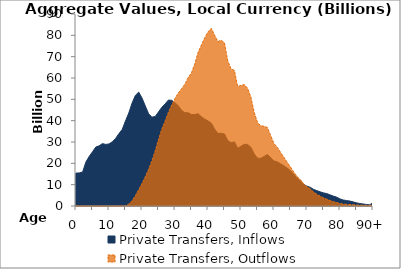
| Category | Private Transfers, Inflows | Private Transfers, Outflows |
|---|---|---|
| 0 | 15424.118 | 0 |
|  | 15508.026 | 0 |
| 2 | 15924.417 | 0 |
| 3 | 20610.805 | 0 |
| 4 | 23240.93 | 0 |
| 5 | 25407.215 | 0 |
| 6 | 27637.973 | 0 |
| 7 | 28204.765 | 0 |
| 8 | 29240.108 | 0 |
| 9 | 28872.986 | 0 |
| 10 | 29076.78 | 0 |
| 11 | 30104.654 | 0 |
| 12 | 31667.287 | 0 |
| 13 | 33916.751 | 0 |
| 14 | 35869.759 | 0 |
| 15 | 39900.61 | 0 |
| 16 | 43595.457 | 883.694 |
| 17 | 48253.527 | 2489.963 |
| 18 | 51865.69 | 4867.217 |
| 19 | 53394.996 | 7628.706 |
| 20 | 50611.978 | 10527.117 |
| 21 | 46886.996 | 13708.263 |
| 22 | 43244.668 | 17188.14 |
| 23 | 41641.143 | 21154.428 |
| 24 | 41950.415 | 25794.757 |
| 25 | 44085.263 | 31074.081 |
| 26 | 46262.269 | 36034.038 |
| 27 | 47843.747 | 39749.822 |
| 28 | 49655.21 | 43872.178 |
| 29 | 49543.745 | 47306.037 |
| 30 | 48342.223 | 50436.195 |
| 31 | 47005.04 | 52994.875 |
| 32 | 44838.663 | 54981.061 |
| 33 | 43709.393 | 57082.451 |
| 34 | 43710.909 | 60201.495 |
| 35 | 42891.553 | 62430.823 |
| 36 | 42863.05 | 66648.182 |
| 37 | 43243.87 | 72008.931 |
| 38 | 41875.267 | 75476.226 |
| 39 | 40717.283 | 78768.706 |
| 40 | 39873.162 | 81591.841 |
| 41 | 38861.077 | 83312.743 |
| 42 | 36048.793 | 80058.21 |
| 43 | 34018.095 | 77086.05 |
| 44 | 34104.392 | 77699.649 |
| 45 | 33731.683 | 76486.409 |
| 46 | 30620.82 | 67987.062 |
| 47 | 29674.507 | 64243.197 |
| 48 | 30062.989 | 63540.632 |
| 49 | 27072.434 | 55990.27 |
| 50 | 28013.59 | 56548.708 |
| 51 | 28912.844 | 56935.456 |
| 52 | 28844.154 | 55181.518 |
| 53 | 27512.142 | 51039.648 |
| 54 | 24408.23 | 43908.49 |
| 55 | 22435.713 | 39134.904 |
| 56 | 22360.447 | 37599.818 |
| 57 | 23233.719 | 37356.406 |
| 58 | 24123.864 | 36831.275 |
| 59 | 22655.52 | 32999.661 |
| 60 | 21086.427 | 29283.111 |
| 61 | 20699.006 | 27527.773 |
| 62 | 19777.314 | 25126.354 |
| 63 | 18865.211 | 22857.733 |
| 64 | 17772.705 | 20487.77 |
| 65 | 16479.895 | 18264.41 |
| 66 | 14853.32 | 15901.42 |
| 67 | 13111.61 | 13815.192 |
| 68 | 11843.818 | 12364.417 |
| 69 | 10129.582 | 10305.055 |
| 70 | 9267.912 | 8994.551 |
| 71 | 8767.361 | 8005.853 |
| 72 | 7776.662 | 6549.634 |
| 73 | 7185.968 | 5477.422 |
| 74 | 6629.71 | 4576.288 |
| 75 | 6150.408 | 3807.618 |
| 76 | 5808.179 | 3216.069 |
| 77 | 5205.745 | 2558.435 |
| 78 | 4628.985 | 2023.489 |
| 79 | 4142.702 | 1607.535 |
| 80 | 3303.745 | 1151.51 |
| 81 | 2808.069 | 893.777 |
| 82 | 2535.951 | 762.473 |
| 83 | 2316.863 | 684.798 |
| 84 | 1921.445 | 587.703 |
| 85 | 1485.32 | 471.236 |
| 86 | 1160.133 | 389.698 |
| 87 | 929.954 | 339.515 |
| 88 | 730.78 | 303.277 |
| 89 | 555.967 | 259.162 |
| 90+ | 1533.944 | 798.796 |